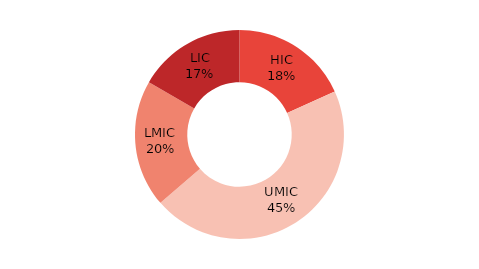
| Category | Series 0 |
|---|---|
| HIC | 4.23 |
| UMIC | 10.523 |
| LMIC | 4.558 |
| LIC | 3.866 |